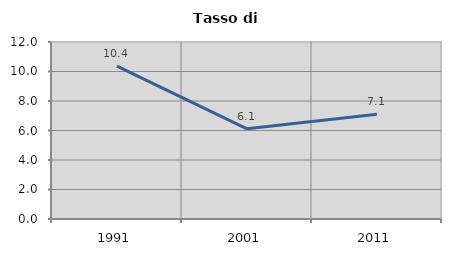
| Category | Tasso di disoccupazione   |
|---|---|
| 1991.0 | 10.359 |
| 2001.0 | 6.115 |
| 2011.0 | 7.104 |